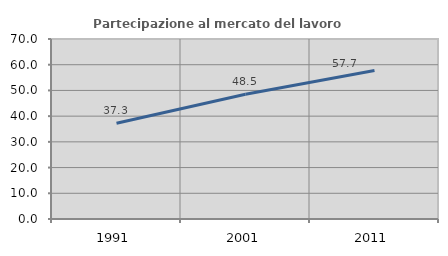
| Category | Partecipazione al mercato del lavoro  femminile |
|---|---|
| 1991.0 | 37.251 |
| 2001.0 | 48.502 |
| 2011.0 | 57.719 |